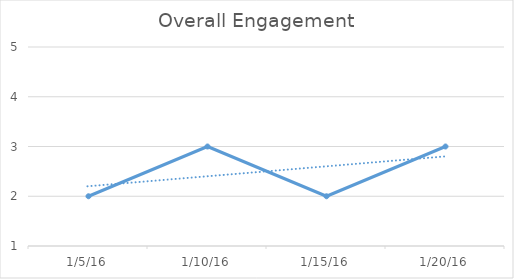
| Category | Series 0 |
|---|---|
| 1/5/16 | 2 |
| 1/10/16 | 3 |
| 1/15/16 | 2 |
| 1/20/16 | 3 |